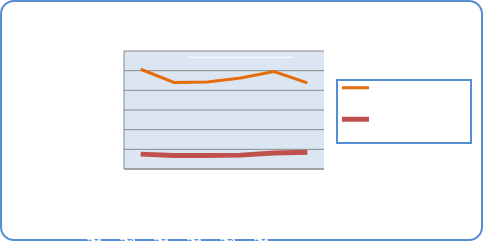
| Category | Motorin Türleri | Benzin Türleri |
|---|---|---|
| 1/14/19 | 50713332.749 | 7563367.004 |
| 1/15/19 | 43994517.048 | 6805553.834 |
| 1/16/19 | 44254116.568 | 6807853.305 |
| 1/17/19 | 46309719.336 | 7054869.042 |
| 1/18/19 | 49592925.259 | 8135673.255 |
| 1/19/19 | 43751253.156 | 8475602.349 |